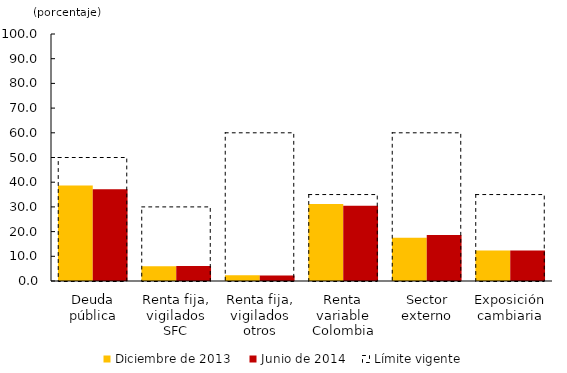
| Category | Diciembre de 2013 | Junio de 2014 |
|---|---|---|
| Deuda pública | 38.668 | 37.156 |
| Renta fija, vigilados SFC | 5.93 | 6.052 |
| Renta fija, vigilados otros | 2.312 | 2.205 |
| Renta variable Colombia | 31.134 | 30.46 |
| Sector externo | 17.513 | 18.61 |
| Exposición cambiaria | 12.369 | 12.369 |